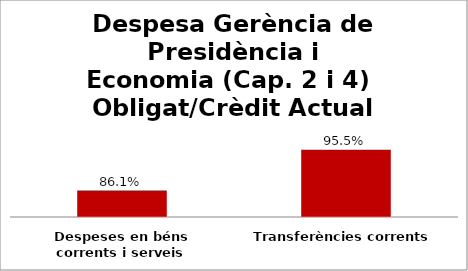
| Category | Series 0 |
|---|---|
| Despeses en béns corrents i serveis | 0.861 |
| Transferències corrents | 0.955 |